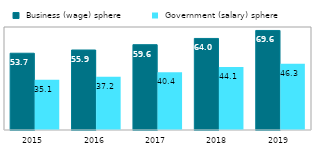
| Category |  Business (wage) sphere |  Government (salary) sphere |
|---|---|---|
| 2015.0 | 53.662 | 35.077 |
| 2016.0 | 55.916 | 37.206 |
| 2017.0 | 59.643 | 40.44 |
| 2018.0 | 63.994 | 44.068 |
| 2019.0 | 69.577 | 46.3 |